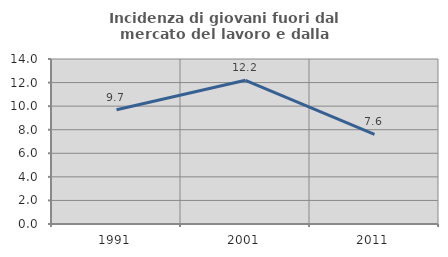
| Category | Incidenza di giovani fuori dal mercato del lavoro e dalla formazione  |
|---|---|
| 1991.0 | 9.697 |
| 2001.0 | 12.195 |
| 2011.0 | 7.595 |